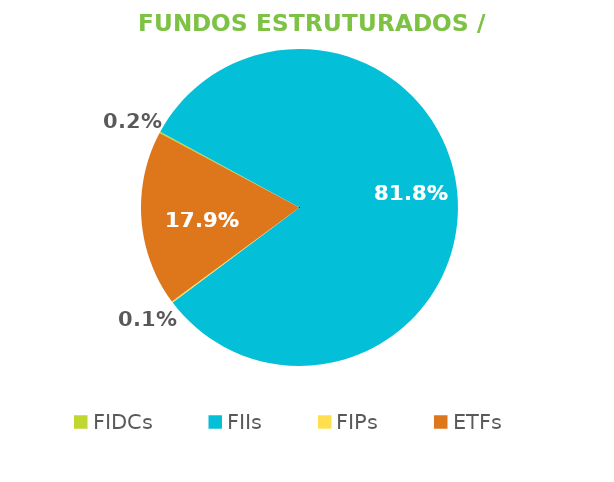
| Category | Fundos Estruturados / ETFs |
|---|---|
| FIDCs | 0.002 |
| FIIs | 0.818 |
| FIPs | 0.001 |
| ETFs | 0.179 |